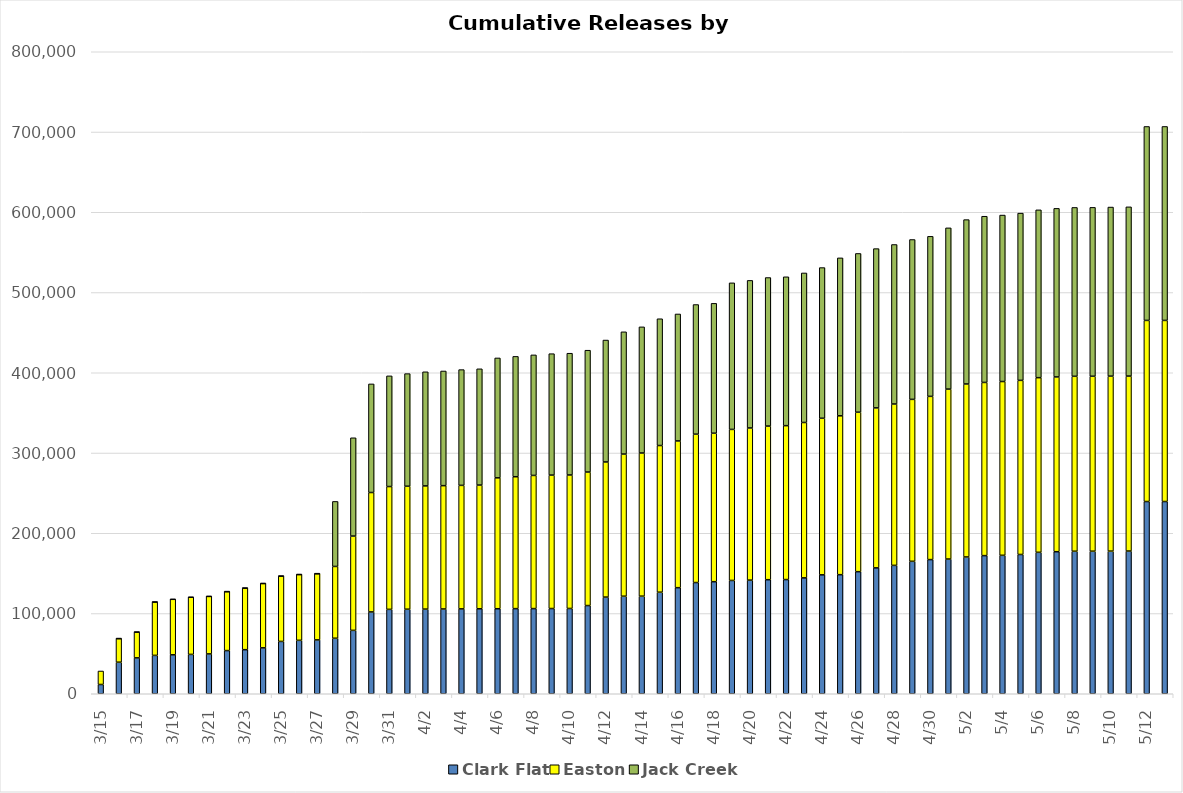
| Category | Clark Flat | Easton | Jack Creek |
|---|---|---|---|
| 2022-03-15 | 11544 | 16813 | 0 |
| 2022-03-16 | 39328 | 29459 | 21 |
| 2022-03-17 | 44728 | 32176 | 21 |
| 2022-03-18 | 47811 | 66549 | 21 |
| 2022-03-19 | 48526 | 69182 | 21 |
| 2022-03-20 | 49031 | 71276 | 21 |
| 2022-03-21 | 49659 | 71706 | 21 |
| 2022-03-22 | 53816 | 73479 | 21 |
| 2022-03-23 | 54926 | 76807 | 21 |
| 2022-03-24 | 57216 | 80240 | 21 |
| 2022-03-25 | 65200 | 81483 | 21 |
| 2022-03-26 | 66583 | 82028 | 21 |
| 2022-03-27 | 67128 | 82518 | 21 |
| 2022-03-28 | 69188 | 89454 | 81025 |
| 2022-03-29 | 79001 | 117481 | 122496 |
| 2022-03-30 | 101986 | 148777 | 135354 |
| 2022-03-31 | 105164 | 153039 | 137932 |
| 2022-04-01 | 105348 | 153246 | 140328 |
| 2022-04-02 | 105452 | 153553 | 142199 |
| 2022-04-03 | 105631 | 153680 | 142901 |
| 2022-04-04 | 105763 | 153899 | 144262 |
| 2022-04-05 | 105861 | 154171 | 144878 |
| 2022-04-06 | 105957 | 163092 | 149409 |
| 2022-04-07 | 106085 | 164350 | 149962 |
| 2022-04-08 | 106118 | 165936 | 150217 |
| 2022-04-09 | 106201 | 166252 | 151301 |
| 2022-04-10 | 106287 | 166336 | 151724 |
| 2022-04-11 | 109911 | 166357 | 151830 |
| 2022-04-12 | 120451 | 168380 | 151937 |
| 2022-04-13 | 121544 | 177136 | 152344 |
| 2022-04-14 | 121597 | 178386 | 157203 |
| 2022-04-15 | 126550 | 182771 | 157970 |
| 2022-04-16 | 132194 | 182848 | 158224 |
| 2022-04-17 | 138576 | 184883 | 161555 |
| 2022-04-18 | 139657 | 185006 | 161830 |
| 2022-04-19 | 141183 | 188216 | 182648 |
| 2022-04-20 | 141602 | 189596 | 183902 |
| 2022-04-21 | 142134 | 191422 | 185110 |
| 2022-04-22 | 142292 | 191788 | 185492 |
| 2022-04-23 | 144402 | 193607 | 186364 |
| 2022-04-24 | 148178 | 195137 | 187746 |
| 2022-04-25 | 148390 | 197962 | 196802 |
| 2022-04-26 | 152136 | 198687 | 197843 |
| 2022-04-27 | 156857 | 199368 | 198460 |
| 2022-04-28 | 159980 | 201083 | 198759 |
| 2022-04-29 | 165049 | 201784 | 199205 |
| 2022-04-30 | 167175 | 203392 | 199438 |
| 2022-05-01 | 167868 | 211781 | 200906 |
| 2022-05-02 | 170449 | 215552 | 204819 |
| 2022-05-03 | 172129 | 215794 | 207115 |
| 2022-05-04 | 172512 | 216561 | 207432 |
| 2022-05-05 | 173558 | 216943 | 208409 |
| 2022-05-06 | 176256 | 217614 | 209136 |
| 2022-05-07 | 177020 | 217777 | 210050 |
| 2022-05-08 | 177572 | 218016 | 210412 |
| 2022-05-09 | 177614 | 218016 | 210454 |
| 2022-05-10 | 177721 | 218016 | 210752 |
| 2022-05-11 | 177838 | 218016 | 210902 |
| 2022-05-12 | 239532 | 225693 | 241678 |
| 2022-05-13 | 239532 | 225693 | 241699 |
| nan | 239532 | 225693 | 241699 |
| nan | 239532 | 225693 | 241699 |
| nan | 239532 | 225693 | 241699 |
| nan | 239532 | 225693 | 241699 |
| nan | 239532 | 225693 | 241699 |
| nan | 239532 | 225693 | 241699 |
| nan | 239532 | 225693 | 241699 |
| nan | 239532 | 225693 | 241699 |